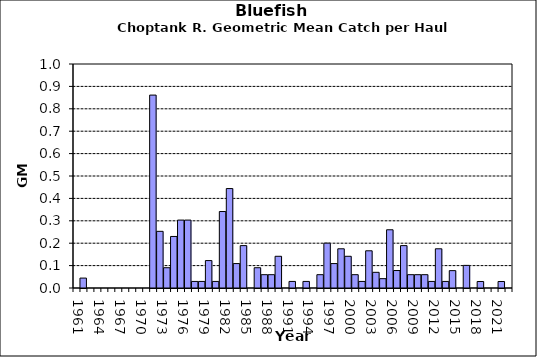
| Category | Series 0 |
|---|---|
| 1961.0 | 0 |
| 1962.0 | 0.044 |
| 1963.0 | 0 |
| 1964.0 | 0 |
| 1965.0 | 0 |
| 1966.0 | 0 |
| 1967.0 | 0 |
| 1968.0 | 0 |
| 1969.0 | 0 |
| 1970.0 | 0 |
| 1971.0 | 0 |
| 1972.0 | 0.861 |
| 1973.0 | 0.253 |
| 1974.0 | 0.091 |
| 1975.0 | 0.23 |
| 1976.0 | 0.303 |
| 1977.0 | 0.303 |
| 1978.0 | 0.029 |
| 1979.0 | 0.029 |
| 1980.0 | 0.122 |
| 1981.0 | 0.029 |
| 1982.0 | 0.341 |
| 1983.0 | 0.444 |
| 1984.0 | 0.109 |
| 1985.0 | 0.189 |
| 1986.0 | 0 |
| 1987.0 | 0.091 |
| 1988.0 | 0.059 |
| 1989.0 | 0.059 |
| 1990.0 | 0.142 |
| 1991.0 | 0 |
| 1992.0 | 0.029 |
| 1993.0 | 0 |
| 1994.0 | 0.029 |
| 1995.0 | 0 |
| 1996.0 | 0.059 |
| 1997.0 | 0.2 |
| 1998.0 | 0.109 |
| 1999.0 | 0.175 |
| 2000.0 | 0.142 |
| 2001.0 | 0.059 |
| 2002.0 | 0.029 |
| 2003.0 | 0.166 |
| 2004.0 | 0.07 |
| 2005.0 | 0.042 |
| 2006.0 | 0.26 |
| 2007.0 | 0.078 |
| 2008.0 | 0.189 |
| 2009.0 | 0.059 |
| 2010.0 | 0.059 |
| 2011.0 | 0.059 |
| 2012.0 | 0.029 |
| 2013.0 | 0.175 |
| 2014.0 | 0.029 |
| 2015.0 | 0.078 |
| 2016.0 | 0 |
| 2017.0 | 0.101 |
| 2018.0 | 0 |
| 2019.0 | 0.029 |
| 2020.0 | 0 |
| 2021.0 | 0 |
| 2022.0 | 0.029 |
| 2023.0 | 0 |